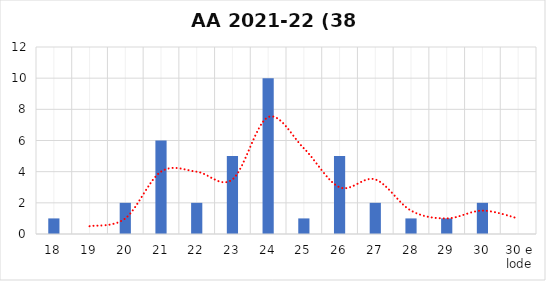
| Category | Series 0 |
|---|---|
| 18 | 1 |
| 19 | 0 |
| 20 | 2 |
| 21 | 6 |
| 22 | 2 |
| 23 | 5 |
| 24 | 10 |
| 25 | 1 |
| 26 | 5 |
| 27 | 2 |
| 28 | 1 |
| 29 | 1 |
| 30 | 2 |
| 30 e lode | 0 |